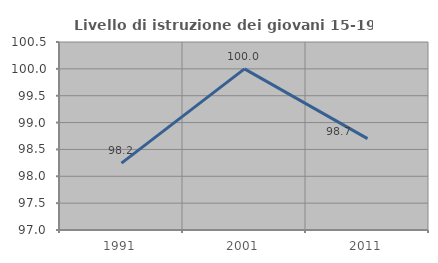
| Category | Livello di istruzione dei giovani 15-19 anni |
|---|---|
| 1991.0 | 98.246 |
| 2001.0 | 100 |
| 2011.0 | 98.701 |